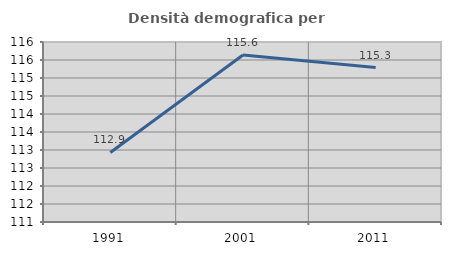
| Category | Densità demografica |
|---|---|
| 1991.0 | 112.931 |
| 2001.0 | 115.641 |
| 2011.0 | 115.291 |